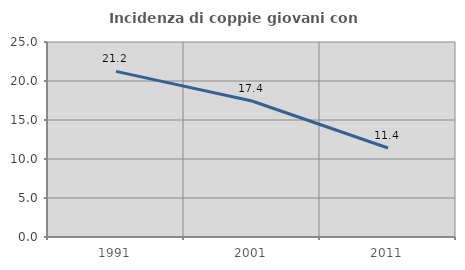
| Category | Incidenza di coppie giovani con figli |
|---|---|
| 1991.0 | 21.23 |
| 2001.0 | 17.435 |
| 2011.0 | 11.41 |